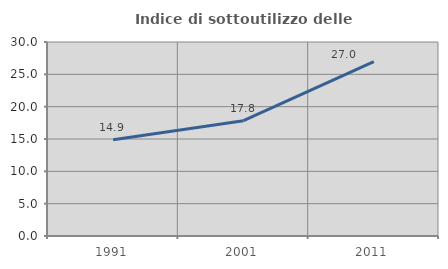
| Category | Indice di sottoutilizzo delle abitazioni  |
|---|---|
| 1991.0 | 14.9 |
| 2001.0 | 17.838 |
| 2011.0 | 26.977 |